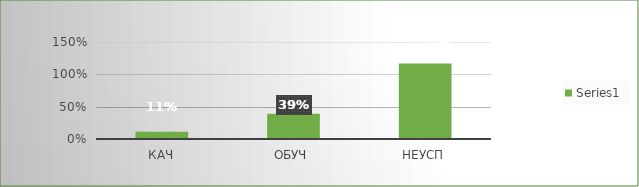
| Category | Series 0 |
|---|---|
| кач | 0.111 |
| обуч | 0.389 |
| неусп | 1.167 |